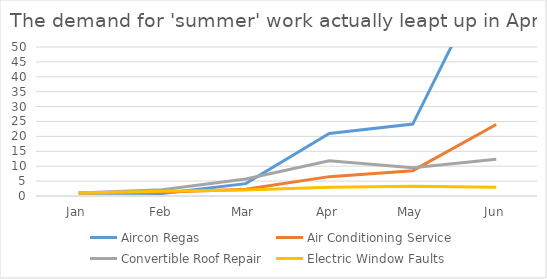
| Category | Aircon Regas | Air Conditioning Service | Convertible Roof Repair | Electric Window Faults |
|---|---|---|---|---|
| Jan | 1 | 1 | 1 | 1 |
| Feb | 0.857 | 1.25 | 2.071 | 1.609 |
| Mar | 4.143 | 2.25 | 5.714 | 2 |
| Apr | 21 | 6.5 | 11.786 | 2.913 |
| May | 24.143 | 8.5 | 9.5 | 3.261 |
| Jun | 80.429 | 24 | 12.357 | 2.913 |